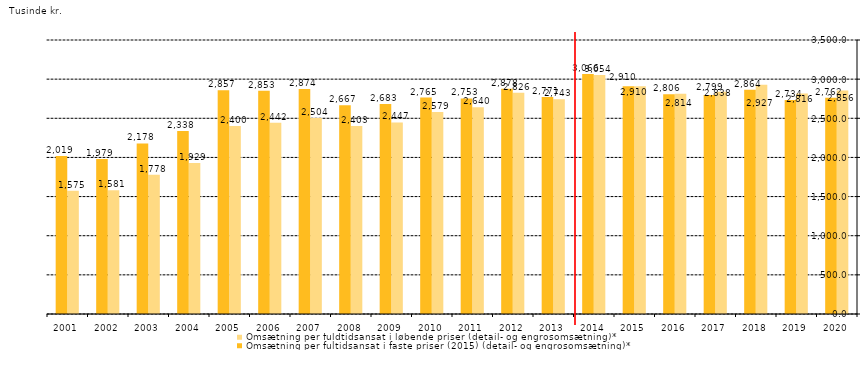
| Category | Omsætning per fuldtidsansat i løbende priser (detail- og engrosomsætning)* | Omsætning per fultidsansat i faste priser (2015) (detail- og engrosomsætning)* |
|---|---|---|
| 2020.0 | 2856.147 | 2762.232 |
| 2019.0 | 2815.583 | 2733.576 |
| 2018.0 | 2927.142 | 2864.131 |
| 2017.0 | 2838 | 2799 |
| 2016.0 | 2814 | 2806 |
| 2015.0 | 2910 | 2910 |
| 2014.0 | 3054 | 3066 |
| 2013.0 | 2743 | 2771 |
| 2012.0 | 2826 | 2878 |
| 2011.0 | 2640 | 2753 |
| 2010.0 | 2579 | 2765 |
| 2009.0 | 2447 | 2683 |
| 2008.0 | 2403 | 2667 |
| 2007.0 | 2504 | 2874 |
| 2006.0 | 2442 | 2853 |
| 2005.0 | 2400 | 2857 |
| 2004.0 | 1929 | 2338 |
| 2003.0 | 1778 | 2178 |
| 2002.0 | 1581 | 1979 |
| 2001.0 | 1575 | 2019 |